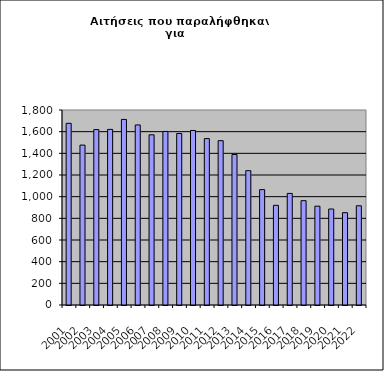
| Category | Series 1 |
|---|---|
| 2001.0 | 1677 |
| 2002.0 | 1476 |
| 2003.0 | 1619 |
| 2004.0 | 1621 |
| 2005.0 | 1713 |
| 2006.0 | 1662 |
| 2007.0 | 1571 |
| 2008.0 | 1602 |
| 2009.0 | 1583 |
| 2010.0 | 1611 |
| 2011.0 | 1536 |
| 2012.0 | 1517 |
| 2013.0 | 1389 |
| 2014.0 | 1240 |
| 2015.0 | 1065 |
| 2016.0 | 920 |
| 2017.0 | 1030 |
| 2018.0 | 963 |
| 2019.0 | 912 |
| 2020.0 | 886 |
| 2021.0 | 852 |
| 2022.0 | 916 |